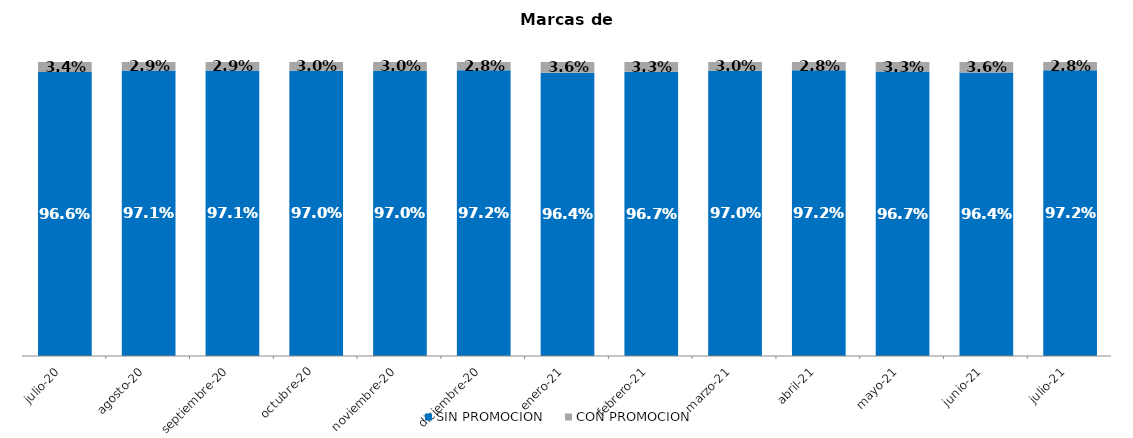
| Category | SIN PROMOCION   | CON PROMOCION   |
|---|---|---|
| 2020-07-01 | 0.966 | 0.034 |
| 2020-08-01 | 0.971 | 0.029 |
| 2020-09-01 | 0.971 | 0.029 |
| 2020-10-01 | 0.97 | 0.03 |
| 2020-11-01 | 0.97 | 0.03 |
| 2020-12-01 | 0.972 | 0.028 |
| 2021-01-01 | 0.964 | 0.036 |
| 2021-02-01 | 0.967 | 0.033 |
| 2021-03-01 | 0.97 | 0.03 |
| 2021-04-01 | 0.972 | 0.028 |
| 2021-05-01 | 0.967 | 0.033 |
| 2021-06-01 | 0.964 | 0.036 |
| 2021-07-01 | 0.972 | 0.028 |